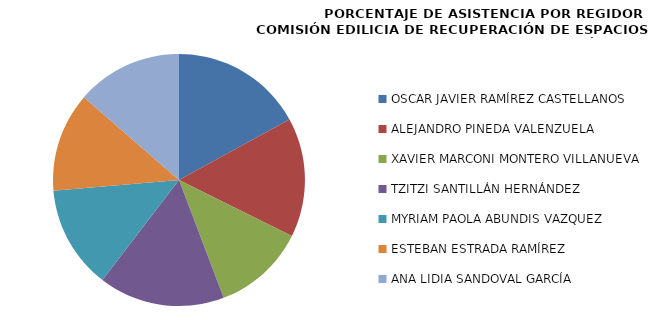
| Category | Series 0 |
|---|---|
| OSCAR JAVIER RAMÍREZ CASTELLANOS | 100 |
| ALEJANDRO PINEDA VALENZUELA | 90 |
| XAVIER MARCONI MONTERO VILLANUEVA | 70 |
| TZITZI SANTILLÁN HERNÁNDEZ | 95 |
| MYRIAM PAOLA ABUNDIS VAZQUEZ | 77.778 |
| ESTEBAN ESTRADA RAMÍREZ | 75 |
| ANA LIDIA SANDOVAL GARCÍA | 80 |